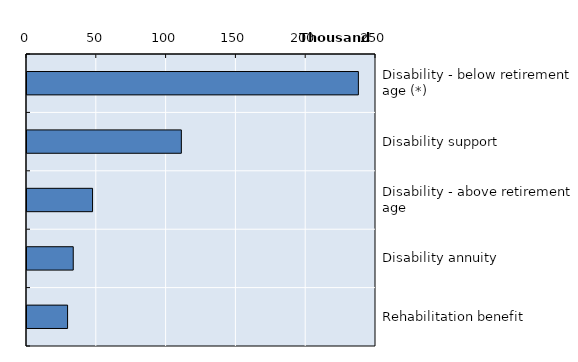
| Category | Series 0 |
|---|---|
| Disability - below retirement age (*) | 237381 |
| Disability support | 110569 |
| Disability - above retirement age | 46955 |
| Disability annuity | 33123 |
| Rehabilitation benefit | 29072 |